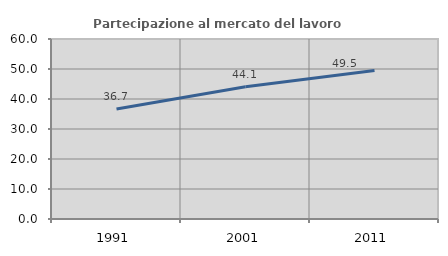
| Category | Partecipazione al mercato del lavoro  femminile |
|---|---|
| 1991.0 | 36.656 |
| 2001.0 | 44.096 |
| 2011.0 | 49.526 |